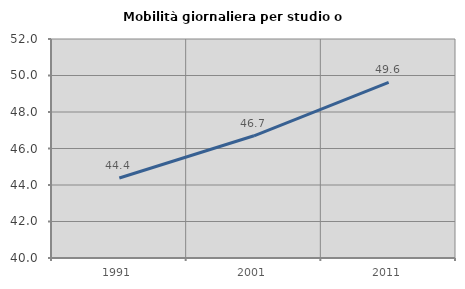
| Category | Mobilità giornaliera per studio o lavoro |
|---|---|
| 1991.0 | 44.385 |
| 2001.0 | 46.697 |
| 2011.0 | 49.624 |